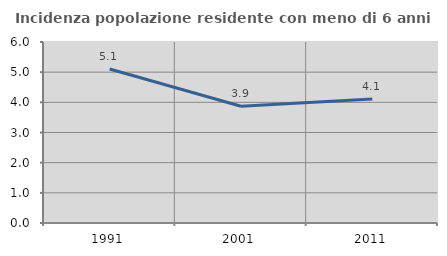
| Category | Incidenza popolazione residente con meno di 6 anni |
|---|---|
| 1991.0 | 5.107 |
| 2001.0 | 3.87 |
| 2011.0 | 4.111 |